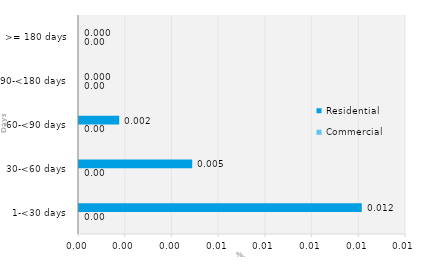
| Category | Commercial | Residential |
|---|---|---|
| 1-<30 days | 0 | 0.012 |
| 30-<60 days | 0 | 0.005 |
| 60-<90 days | 0 | 0.002 |
| 90-<180 days | 0 | 0 |
| >= 180 days | 0 | 0 |